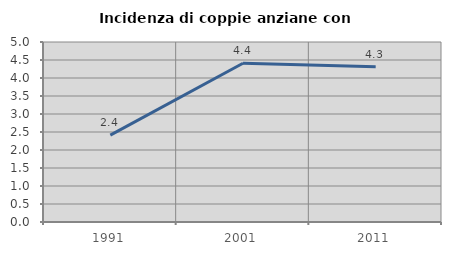
| Category | Incidenza di coppie anziane con figli |
|---|---|
| 1991.0 | 2.414 |
| 2001.0 | 4.41 |
| 2011.0 | 4.312 |